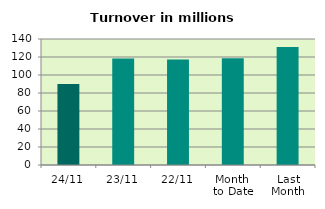
| Category | Series 0 |
|---|---|
| 24/11 | 90.062 |
| 23/11 | 118.455 |
| 22/11 | 117.25 |
| Month 
to Date | 118.646 |
| Last
Month | 131.017 |